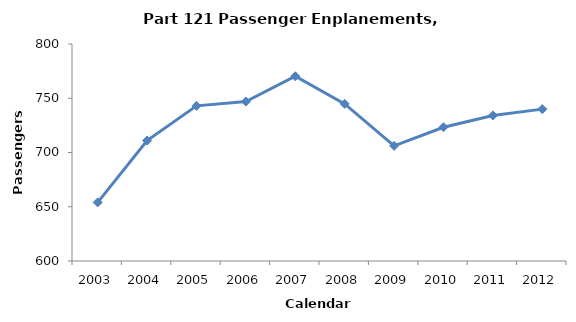
| Category | Passengers (millions) |
|---|---|
| 2003.0 | 654 |
| 2004.0 | 711 |
| 2005.0 | 743 |
| 2006.0 | 747 |
| 2007.0 | 770.262 |
| 2008.0 | 744.825 |
| 2009.0 | 706.106 |
| 2010.0 | 723.291 |
| 2011.0 | 734.155 |
| 2012.0 | 739.977 |